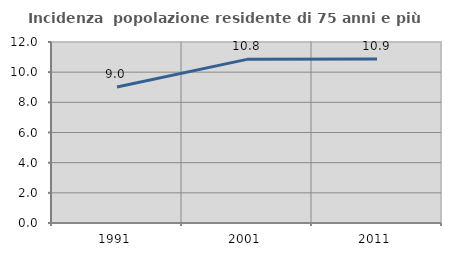
| Category | Incidenza  popolazione residente di 75 anni e più |
|---|---|
| 1991.0 | 9.011 |
| 2001.0 | 10.848 |
| 2011.0 | 10.874 |